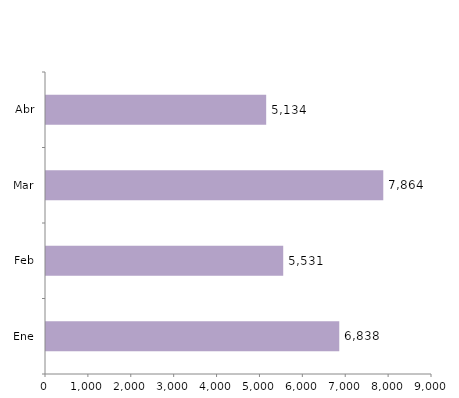
| Category | Series 0 |
|---|---|
| Ene | 6838 |
| Feb | 5531 |
| Mar | 7864 |
| Abr | 5134 |